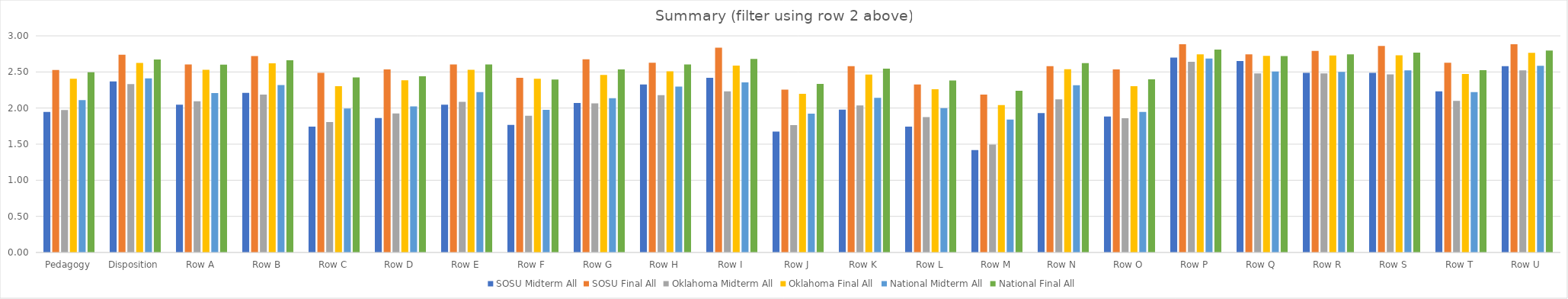
| Category | SOSU | Oklahoma | National |
|---|---|---|---|
| Pedagogy | 2.528 | 2.407 | 2.496 |
| Disposition | 2.738 | 2.625 | 2.673 |
| Row A | 2.605 | 2.529 | 2.602 |
| Row B | 2.721 | 2.62 | 2.661 |
| Row C | 2.488 | 2.302 | 2.424 |
| Row D | 2.535 | 2.384 | 2.441 |
| Row E | 2.605 | 2.529 | 2.604 |
| Row F | 2.419 | 2.405 | 2.395 |
| Row G | 2.674 | 2.459 | 2.536 |
| Row H | 2.628 | 2.508 | 2.604 |
| Row I | 2.837 | 2.587 | 2.68 |
| Row J | 2.256 | 2.198 | 2.336 |
| Row K | 2.581 | 2.463 | 2.546 |
| Row L | 2.326 | 2.26 | 2.383 |
| Row M | 2.186 | 2.041 | 2.24 |
| Row N | 2.581 | 2.537 | 2.622 |
| Row O | 2.535 | 2.302 | 2.398 |
| Row P | 2.884 | 2.744 | 2.809 |
| Row Q | 2.744 | 2.723 | 2.72 |
| Row R | 2.791 | 2.727 | 2.744 |
| Row S | 2.86 | 2.731 | 2.768 |
| Row T | 2.628 | 2.471 | 2.524 |
| Row U | 2.884 | 2.764 | 2.797 |